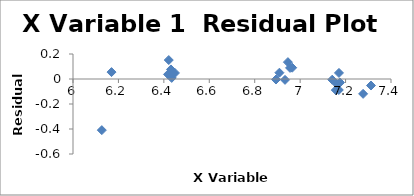
| Category | Series 0 |
|---|---|
| 6.9650803456014065 | 0.09 |
| 6.955592608396297 | 0.089 |
| 6.946013991099227 | 0.135 |
| 6.933423025730715 | -0.007 |
| 6.90875477931522 | 0.05 |
| 6.893656354602635 | -0.004 |
| 7.277247726631484 | -0.119 |
| 6.126869184114185 | -0.409 |
| 7.141245122350491 | -0.006 |
| 7.1569563646156364 | -0.089 |
| 7.170888478512505 | 0.049 |
| 7.160069207596127 | -0.037 |
| 7.170119543449628 | -0.088 |
| 7.175489713624222 | -0.028 |
| 6.448889394146858 | 0.048 |
| 6.431331081933479 | 0.076 |
| 6.434546518787453 | 0.009 |
| 6.429719478039138 | 0.048 |
| 6.418364935936212 | 0.037 |
| 6.421622267806518 | 0.152 |
| 6.169610732491456 | 0.055 |
| 7.311886164077165 | -0.052 |